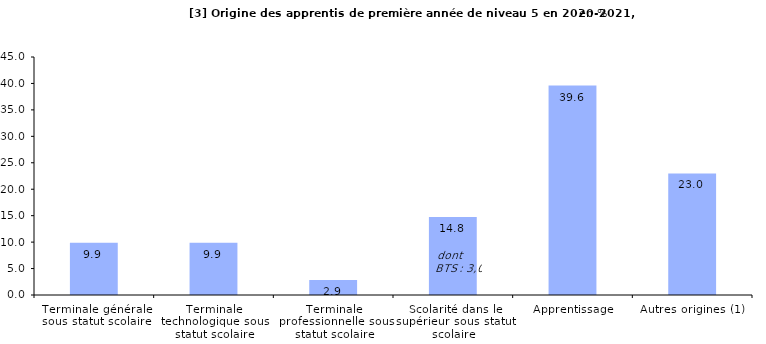
| Category | Series 0 |
|---|---|
| Terminale générale sous statut scolaire | 9.899 |
| Terminale technologique sous statut scolaire | 9.899 |
| Terminale professionnelle sous statut scolaire | 2.852 |
| Scolarité dans le supérieur sous statut scolaire | 14.765 |
| Apprentissage | 39.597 |
| Autres origines (1) | 22.987 |